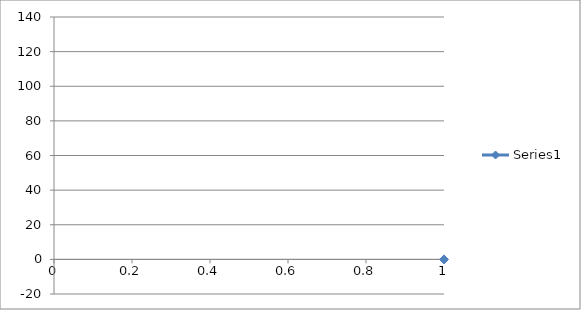
| Category | Series 0 |
|---|---|
| 0 | -0.027 |
| 1 | -0.006 |
| 2 | 0 |
| 3 | 0.018 |
| 4 | 0.009 |
| 5 | 0.024 |
| 6 | 0.032 |
| 7 | 0.05 |
| 8 | 0.069 |
| 9 | 0.083 |
| 10 | 0.1 |
| 11 | 0.115 |
| 12 | 0.156 |
| 13 | 0.176 |
| 14 | 0.21 |
| 15 | 0.248 |
| 16 | 0.317 |
| 17 | 0.381 |
| 18 | 0.456 |
| 19 | 0.539 |
| 20 | 0.636 |
| 21 | 0.737 |
| 22 | 0.893 |
| 23 | 1.068 |
| 24 | 1.316 |
| 25 | 1.592 |
| 26 | 1.968 |
| 27 | 2.441 |
| 28 | 3.039 |
| 29 | 3.821 |
| 30 | 5.347 |
| 31 | 5.856 |
| 32 | 6.461 |
| 33 | 7.042 |
| 34 | 7.888 |
| 35 | 9.276 |
| 36 | 9.833 |
| 37 | 11.393 |
| 38 | 12.713 |
| 39 | 14.134 |
| 40 | 15.733 |
| 41 | 17.414 |
| 42 | 19.547 |
| 43 | 22.106 |
| 44 | 24.751 |
| 45 | 27.571 |
| 46 | 30.429 |
| 47 | 34.235 |
| 48 | 37.641 |
| 49 | 41.925 |
| 50 | 45.962 |
| 51 | 50.462 |
| 52 | 54.821 |
| 53 | 59.835 |
| 54 | 64.816 |
| 55 | 69.705 |
| 56 | 74.525 |
| 57 | 79.377 |
| 58 | 83.936 |
| 59 | 88.469 |
| 60 | 93.102 |
| 61 | 96.926 |
| 62 | 100.261 |
| 63 | 103.925 |
| 64 | 106.726 |
| 65 | 109.614 |
| 66 | 112.018 |
| 67 | 113.651 |
| 68 | 115.524 |
| 69 | 116.982 |
| 70 | 118.373 |
| 71 | 118.912 |
| 72 | 119.702 |
| 73 | 120.25 |
| 74 | 120.713 |
| 75 | 121.077 |
| 76 | 121.326 |
| 77 | 121.47 |
| 78 | 121.519 |
| 79 | 121.537 |
| 80 | 121.498 |
| 81 | 121.432 |
| 82 | 121.338 |
| 83 | 121.217 |
| 84 | 121.056 |
| 85 | 120.822 |
| 86 | 120.543 |
| 87 | 120.093 |
| 88 | 119.636 |
| 89 | 118.94 |
| 90 | 117.516 |
| 91 | 116.217 |
| 92 | 114.783 |
| 93 | 113.291 |
| 94 | 111.409 |
| 95 | 108.668 |
| 96 | 106.071 |
| 97 | 102.986 |
| 98 | 99.818 |
| 99 | 95.961 |
| 100 | 91.878 |
| 101 | 87.719 |
| 102 | 83.404 |
| 103 | 78.369 |
| 104 | 73.853 |
| 105 | 68.734 |
| 106 | 63.883 |
| 107 | 59.393 |
| 108 | 54.246 |
| 109 | 49.617 |
| 110 | 45.32 |
| 111 | 41.158 |
| 112 | 37.278 |
| 113 | 33.987 |
| 114 | 30.389 |
| 115 | 27.452 |
| 116 | 24.551 |
| 117 | 21.821 |
| 118 | 20.03 |
| 119 | 17.472 |
| 120 | 15.972 |
| 121 | 14.315 |
| 122 | 12.814 |
| 123 | 11.452 |
| 124 | 10.209 |
| 125 | 9.652 |
| 126 | 8.308 |
| 127 | 7.839 |
| 128 | 7.105 |
| 129 | 6.558 |
| 130 | 5.99 |
| 131 | 4.499 |
| 132 | 3.902 |
| 133 | 3.197 |
| 134 | 2.637 |
| 135 | 2.175 |
| 136 | 1.77 |
| 137 | 1.506 |
| 138 | 1.269 |
| 139 | 1.089 |
| 140 | 0.933 |
| 141 | 0.801 |
| 142 | 0.703 |
| 143 | 0.632 |
| 144 | 0.591 |
| 145 | 0.514 |
| 146 | 0.47 |
| 147 | 0.429 |
| 148 | 0.402 |
| 149 | 0.393 |
| 150 | 0.386 |
| 151 | 0.371 |
| 152 | 0.347 |
| 153 | 0.341 |
| 154 | 0.326 |
| 155 | 0.307 |
| 156 | 0.293 |
| 157 | 0.28 |
| 158 | 0.265 |
| 159 | 0.27 |
| 160 | 0.268 |